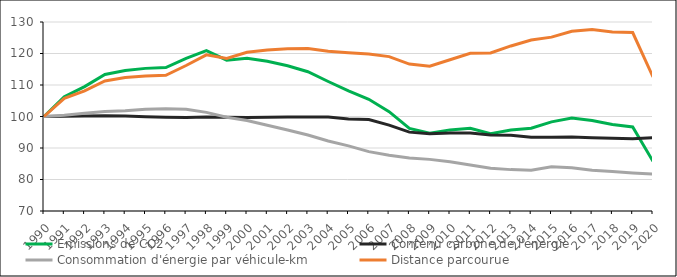
| Category | Émissions de CO2 | Contenu carbone de l'énergie | Consommation d'énergie par véhicule-km | Distance parcourue |
|---|---|---|---|---|
| 1990.0 | 100 | 100 | 100 | 100 |
| 1991.0 | 106.287 | 100.094 | 100.426 | 105.736 |
| 1992.0 | 109.484 | 100.195 | 101.027 | 108.161 |
| 1993.0 | 113.348 | 100.257 | 101.582 | 111.297 |
| 1994.0 | 114.607 | 100.123 | 101.851 | 112.386 |
| 1995.0 | 115.278 | 99.912 | 102.264 | 112.826 |
| 1996.0 | 115.542 | 99.74 | 102.431 | 113.094 |
| 1997.0 | 118.476 | 99.682 | 102.294 | 116.188 |
| 1998.0 | 120.902 | 99.81 | 101.313 | 119.562 |
| 1999.0 | 117.887 | 99.771 | 99.771 | 118.429 |
| 2000.0 | 118.475 | 99.7 | 98.714 | 120.38 |
| 2001.0 | 117.519 | 99.759 | 97.25 | 121.134 |
| 2002.0 | 116.089 | 99.806 | 95.721 | 121.514 |
| 2003.0 | 114.206 | 99.811 | 94.133 | 121.553 |
| 2004.0 | 111.108 | 99.842 | 92.211 | 120.683 |
| 2005.0 | 108.16 | 99.22 | 90.685 | 120.207 |
| 2006.0 | 105.448 | 99.024 | 88.845 | 119.857 |
| 2007.0 | 101.549 | 97.27 | 87.721 | 119.013 |
| 2008.0 | 96.22 | 95.036 | 86.802 | 116.64 |
| 2009.0 | 94.676 | 94.517 | 86.39 | 115.948 |
| 2010.0 | 95.751 | 94.746 | 85.625 | 118.026 |
| 2011.0 | 96.251 | 94.765 | 84.605 | 120.05 |
| 2012.0 | 94.525 | 94.113 | 83.587 | 120.159 |
| 2013.0 | 95.694 | 94.045 | 83.136 | 122.394 |
| 2014.0 | 96.261 | 93.385 | 82.937 | 124.287 |
| 2015.0 | 98.293 | 93.382 | 84.08 | 125.19 |
| 2016.0 | 99.489 | 93.508 | 83.721 | 127.083 |
| 2017.0 | 98.72 | 93.271 | 82.941 | 127.611 |
| 2018.0 | 97.459 | 93.11 | 82.508 | 126.862 |
| 2019.0 | 96.673 | 92.97 | 82.093 | 126.665 |
| 2020.0 | 85.77 | 93.243 | 81.735 | 112.542 |